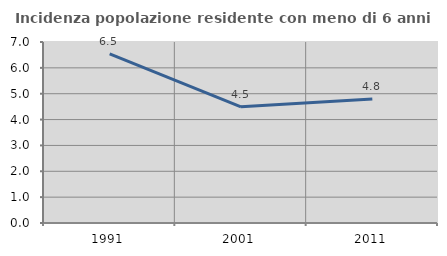
| Category | Incidenza popolazione residente con meno di 6 anni |
|---|---|
| 1991.0 | 6.543 |
| 2001.0 | 4.492 |
| 2011.0 | 4.799 |